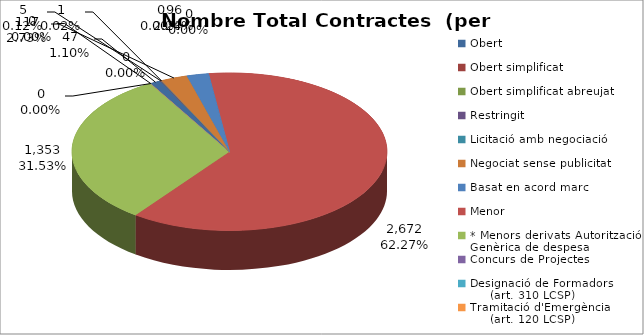
| Category | Nombre Total Contractes |
|---|---|
| Obert | 47 |
| Obert simplificat | 5 |
| Obert simplificat abreujat | 1 |
| Restringit | 0 |
| Licitació amb negociació | 0 |
| Negociat sense publicitat | 117 |
| Basat en acord marc | 96 |
| Menor | 2672 |
| * Menors derivats Autorització Genèrica de despesa | 1353 |
| Concurs de Projectes | 0 |
| Designació de Formadors
     (art. 310 LCSP) | 0 |
| Tramitació d'Emergència
     (art. 120 LCSP) | 0 |